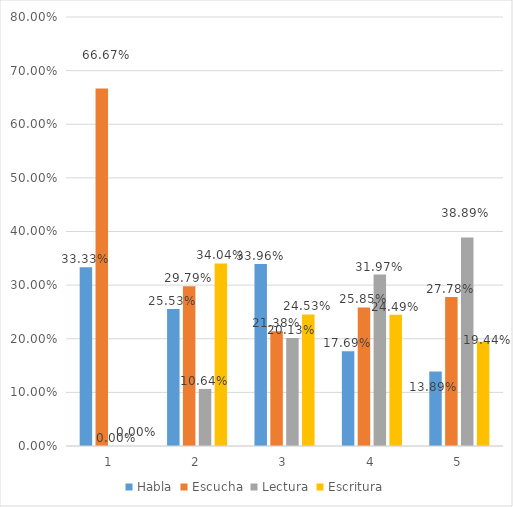
| Category | Habla | Escucha | Lectura | Escritura |
|---|---|---|---|---|
| 0 | 0.333 | 0.667 | 0 | 0 |
| 1 | 0.255 | 0.298 | 0.106 | 0.34 |
| 2 | 0.34 | 0.214 | 0.201 | 0.245 |
| 3 | 0.177 | 0.259 | 0.32 | 0.245 |
| 4 | 0.139 | 0.278 | 0.389 | 0.194 |